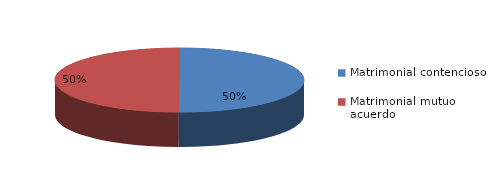
| Category | Series 0 |
|---|---|
| 0 | 765 |
| 1 | 762 |